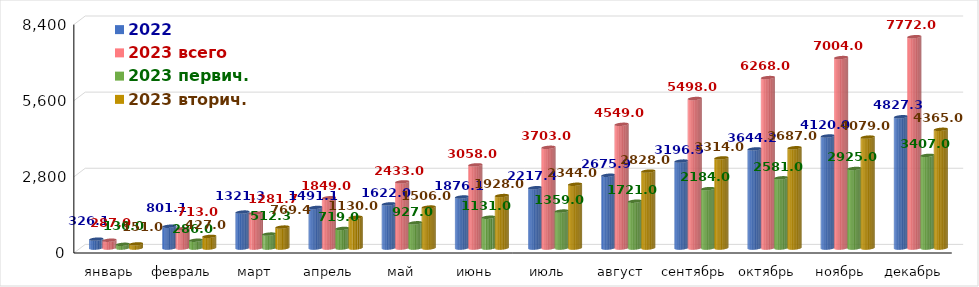
| Category | 2022 | 2023 всего | 2023 первич. | 2023 вторич. |
|---|---|---|---|---|
| январь | 326.136 | 287 | 136 | 151 |
| февраль | 801.124 | 713 | 286 | 427 |
| март | 1321.34 | 1281.7 | 512.3 | 769.4 |
| апрель | 1491.129 | 1849 | 719 | 1130 |
| май | 1622 | 2433 | 927 | 1506 |
| июнь | 1876.074 | 3058 | 1131 | 1928 |
| июль | 2217.365 | 3703 | 1359 | 2344 |
| август | 2675.882 | 4549 | 1721 | 2828 |
| сентябрь | 3196.512 | 5498 | 2184 | 3314 |
| октябрь | 3644.186 | 6268 | 2581 | 3687 |
| ноябрь | 4120 | 7004 | 2925 | 4079 |
| декабрь | 4827.329 | 7772 | 3407 | 4365 |